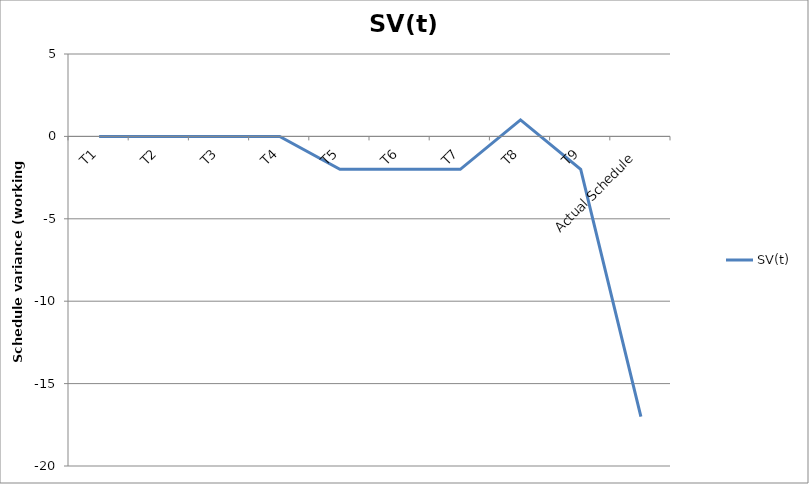
| Category | SV(t) |
|---|---|
| T1 | 0 |
| T2 | 0 |
| T3 | 0 |
| T4 | 0 |
| T5 | -2 |
| T6 | -2 |
| T7 | -2 |
| T8 | 1 |
| T9 | -2 |
| Actual Schedule | -17 |